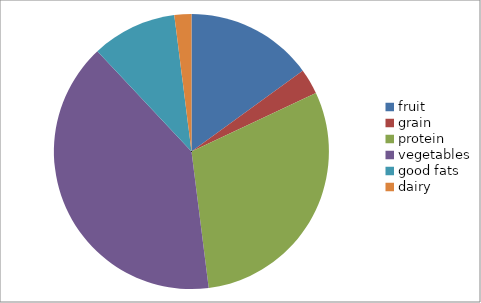
| Category | Series 0 |
|---|---|
| fruit | 15 |
| grain | 3 |
| protein | 30 |
| vegetables | 40 |
| good fats | 10 |
| dairy | 2 |